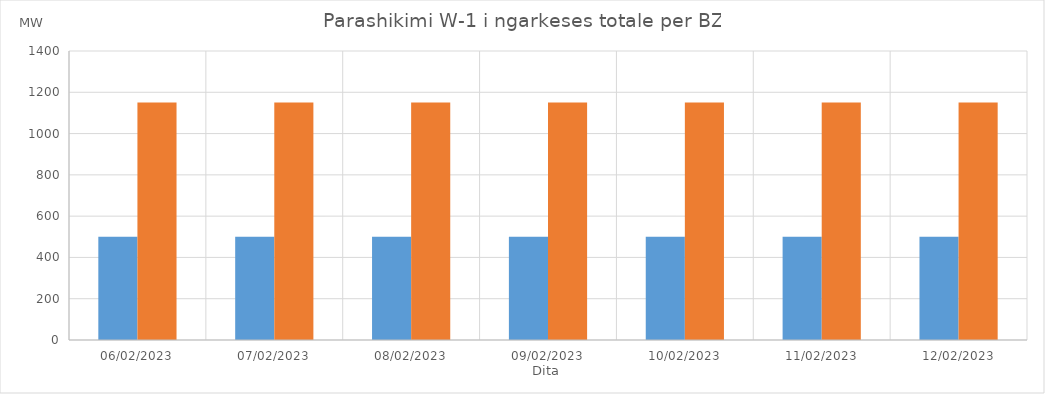
| Category | Min (MW) | Max (MW) |
|---|---|---|
| 06/02/2023 | 500 | 1150 |
| 07/02/2023 | 500 | 1150 |
| 08/02/2023 | 500 | 1150 |
| 09/02/2023 | 500 | 1150 |
| 10/02/2023 | 500 | 1150 |
| 11/02/2023 | 500 | 1150 |
| 12/02/2023 | 500 | 1150 |